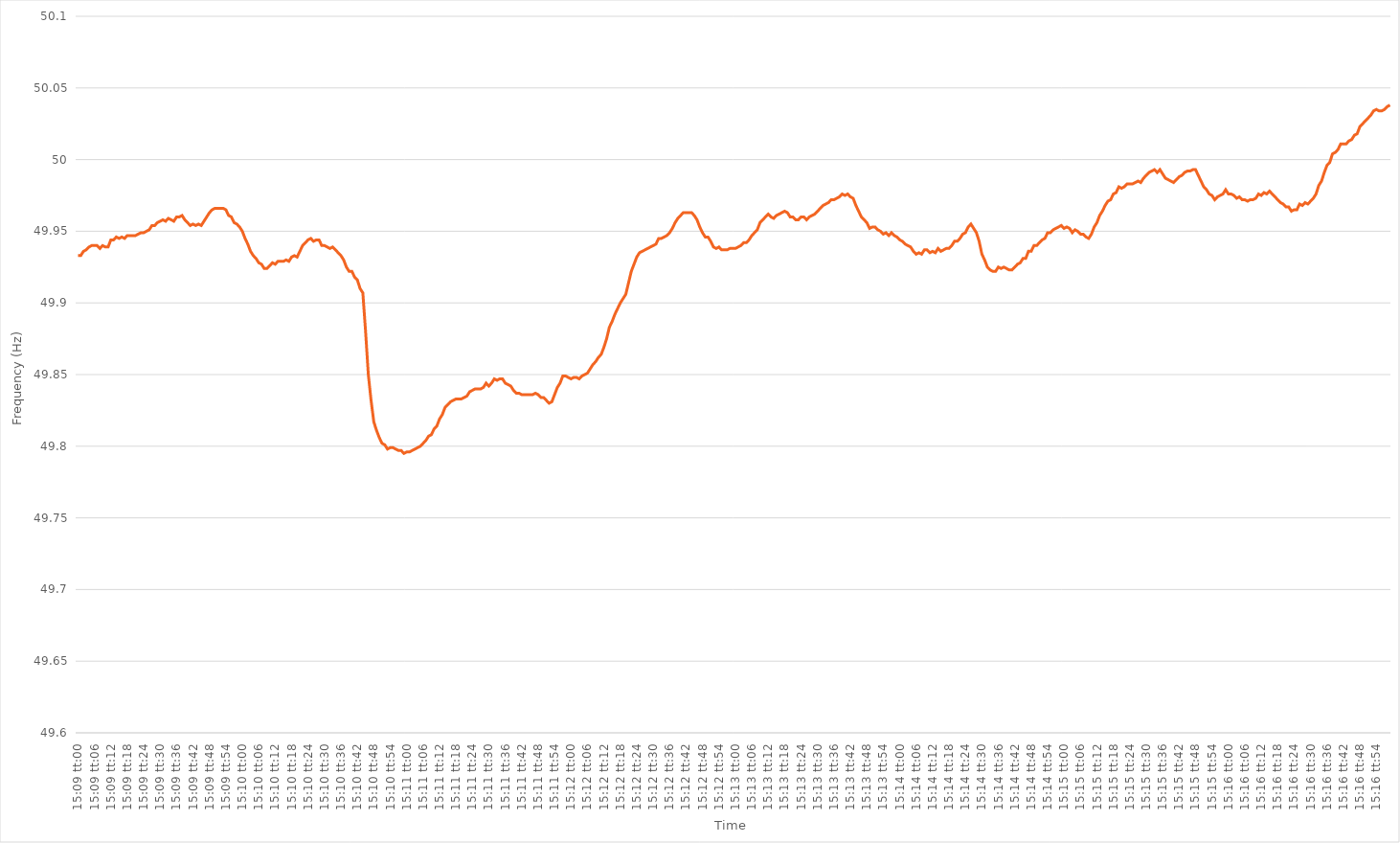
| Category | Series 0 |
|---|---|
| 0.63125 | 49.933 |
| 0.631261574074074 | 49.933 |
| 0.6312731481481482 | 49.936 |
| 0.6312847222222222 | 49.937 |
| 0.6312962962962964 | 49.939 |
| 0.6313078703703704 | 49.94 |
| 0.6313194444444444 | 49.94 |
| 0.6313310185185185 | 49.94 |
| 0.6313425925925926 | 49.938 |
| 0.6313541666666667 | 49.94 |
| 0.6313657407407408 | 49.939 |
| 0.6313773148148148 | 49.939 |
| 0.6313888888888889 | 49.944 |
| 0.6314004629629629 | 49.944 |
| 0.631412037037037 | 49.946 |
| 0.6314236111111111 | 49.945 |
| 0.6314351851851852 | 49.946 |
| 0.6314467592592593 | 49.945 |
| 0.6314583333333333 | 49.947 |
| 0.6314699074074074 | 49.947 |
| 0.6314814814814814 | 49.947 |
| 0.6314930555555556 | 49.947 |
| 0.6315046296296296 | 49.948 |
| 0.6315162037037038 | 49.949 |
| 0.6315277777777778 | 49.949 |
| 0.6315393518518518 | 49.95 |
| 0.6315509259259259 | 49.951 |
| 0.6315625 | 49.954 |
| 0.6315740740740741 | 49.954 |
| 0.6315856481481482 | 49.956 |
| 0.6315972222222223 | 49.957 |
| 0.6316087962962963 | 49.958 |
| 0.6316203703703703 | 49.957 |
| 0.6316319444444445 | 49.959 |
| 0.6316435185185185 | 49.958 |
| 0.6316550925925926 | 49.957 |
| 0.6316666666666667 | 49.96 |
| 0.6316782407407407 | 49.96 |
| 0.6316898148148148 | 49.961 |
| 0.6317013888888888 | 49.958 |
| 0.631712962962963 | 49.956 |
| 0.631724537037037 | 49.954 |
| 0.6317361111111112 | 49.955 |
| 0.6317476851851852 | 49.954 |
| 0.6317592592592592 | 49.955 |
| 0.6317708333333333 | 49.954 |
| 0.6317824074074074 | 49.957 |
| 0.6317939814814815 | 49.96 |
| 0.6318055555555556 | 49.963 |
| 0.6318171296296297 | 49.965 |
| 0.6318287037037037 | 49.966 |
| 0.6318402777777777 | 49.966 |
| 0.6318518518518519 | 49.966 |
| 0.6318634259259259 | 49.966 |
| 0.631875 | 49.965 |
| 0.6318865740740741 | 49.961 |
| 0.6318981481481482 | 49.96 |
| 0.6319097222222222 | 49.956 |
| 0.6319212962962962 | 49.955 |
| 0.6319328703703704 | 49.953 |
| 0.6319444444444444 | 49.95 |
| 0.6319560185185186 | 49.945 |
| 0.6319675925925926 | 49.941 |
| 0.6319791666666666 | 49.936 |
| 0.6319907407407407 | 49.933 |
| 0.6320023148148148 | 49.931 |
| 0.6320138888888889 | 49.928 |
| 0.632025462962963 | 49.927 |
| 0.6320370370370371 | 49.924 |
| 0.6320486111111111 | 49.924 |
| 0.6320601851851851 | 49.926 |
| 0.6320717592592593 | 49.928 |
| 0.6320833333333333 | 49.927 |
| 0.6320949074074075 | 49.929 |
| 0.6321064814814815 | 49.929 |
| 0.6321180555555556 | 49.929 |
| 0.6321296296296296 | 49.93 |
| 0.6321412037037036 | 49.929 |
| 0.6321527777777778 | 49.932 |
| 0.6321643518518518 | 49.933 |
| 0.632175925925926 | 49.932 |
| 0.6321875 | 49.936 |
| 0.632199074074074 | 49.94 |
| 0.6322106481481481 | 49.942 |
| 0.6322222222222222 | 49.944 |
| 0.6322337962962963 | 49.945 |
| 0.6322453703703704 | 49.943 |
| 0.6322569444444445 | 49.944 |
| 0.6322685185185185 | 49.944 |
| 0.6322800925925925 | 49.94 |
| 0.6322916666666667 | 49.94 |
| 0.6323032407407407 | 49.939 |
| 0.6323148148148149 | 49.938 |
| 0.6323263888888889 | 49.939 |
| 0.632337962962963 | 49.937 |
| 0.632349537037037 | 49.935 |
| 0.632361111111111 | 49.933 |
| 0.6323726851851852 | 49.93 |
| 0.6323842592592592 | 49.925 |
| 0.6323958333333334 | 49.922 |
| 0.6324074074074074 | 49.922 |
| 0.6324189814814815 | 49.918 |
| 0.6324305555555555 | 49.916 |
| 0.6324421296296296 | 49.91 |
| 0.6324537037037037 | 49.907 |
| 0.6324652777777778 | 49.88 |
| 0.6324768518518519 | 49.85 |
| 0.6324884259259259 | 49.832 |
| 0.6325 | 49.817 |
| 0.6325115740740741 | 49.811 |
| 0.6325231481481481 | 49.806 |
| 0.6325347222222223 | 49.802 |
| 0.6325462962962963 | 49.801 |
| 0.6325578703703704 | 49.798 |
| 0.6325694444444444 | 49.799 |
| 0.6325810185185184 | 49.799 |
| 0.6325925925925926 | 49.798 |
| 0.6326041666666666 | 49.797 |
| 0.6326157407407408 | 49.797 |
| 0.6326273148148148 | 49.795 |
| 0.6326388888888889 | 49.796 |
| 0.6326504629629629 | 49.796 |
| 0.632662037037037 | 49.797 |
| 0.6326736111111111 | 49.798 |
| 0.6326851851851852 | 49.799 |
| 0.6326967592592593 | 49.8 |
| 0.6327083333333333 | 49.802 |
| 0.6327199074074074 | 49.804 |
| 0.6327314814814815 | 49.807 |
| 0.6327430555555555 | 49.808 |
| 0.6327546296296297 | 49.812 |
| 0.6327662037037037 | 49.814 |
| 0.6327777777777778 | 49.819 |
| 0.6327893518518518 | 49.822 |
| 0.632800925925926 | 49.827 |
| 0.6328125 | 49.829 |
| 0.632824074074074 | 49.831 |
| 0.6328356481481482 | 49.832 |
| 0.6328472222222222 | 49.833 |
| 0.6328587962962963 | 49.833 |
| 0.6328703703703703 | 49.833 |
| 0.6328819444444445 | 49.834 |
| 0.6328935185185185 | 49.835 |
| 0.6329050925925926 | 49.838 |
| 0.6329166666666667 | 49.839 |
| 0.6329282407407407 | 49.84 |
| 0.6329398148148148 | 49.84 |
| 0.6329513888888889 | 49.84 |
| 0.632962962962963 | 49.841 |
| 0.6329745370370371 | 49.844 |
| 0.6329861111111111 | 49.842 |
| 0.6329976851851852 | 49.844 |
| 0.6330092592592592 | 49.847 |
| 0.6330208333333334 | 49.846 |
| 0.6330324074074074 | 49.847 |
| 0.6330439814814816 | 49.847 |
| 0.6330555555555556 | 49.844 |
| 0.6330671296296296 | 49.843 |
| 0.6330787037037037 | 49.842 |
| 0.6330902777777777 | 49.839 |
| 0.6331018518518519 | 49.837 |
| 0.6331134259259259 | 49.837 |
| 0.633125 | 49.836 |
| 0.6331365740740741 | 49.836 |
| 0.6331481481481481 | 49.836 |
| 0.6331597222222222 | 49.836 |
| 0.6331712962962963 | 49.836 |
| 0.6331828703703704 | 49.837 |
| 0.6331944444444445 | 49.836 |
| 0.6332060185185185 | 49.834 |
| 0.6332175925925926 | 49.834 |
| 0.6332291666666666 | 49.832 |
| 0.6332407407407408 | 49.83 |
| 0.6332523148148148 | 49.831 |
| 0.633263888888889 | 49.836 |
| 0.633275462962963 | 49.841 |
| 0.633287037037037 | 49.844 |
| 0.6332986111111111 | 49.849 |
| 0.6333101851851851 | 49.849 |
| 0.6333217592592593 | 49.848 |
| 0.6333333333333333 | 49.847 |
| 0.6333449074074075 | 49.848 |
| 0.6333564814814815 | 49.848 |
| 0.6333680555555555 | 49.847 |
| 0.6333796296296296 | 49.849 |
| 0.6333912037037037 | 49.85 |
| 0.6334027777777778 | 49.851 |
| 0.6334143518518519 | 49.854 |
| 0.633425925925926 | 49.857 |
| 0.6334375 | 49.859 |
| 0.633449074074074 | 49.862 |
| 0.6334606481481482 | 49.864 |
| 0.6334722222222222 | 49.869 |
| 0.6334837962962964 | 49.875 |
| 0.6334953703703704 | 49.883 |
| 0.6335069444444444 | 49.887 |
| 0.6335185185185185 | 49.892 |
| 0.6335300925925925 | 49.896 |
| 0.6335416666666667 | 49.9 |
| 0.6335532407407407 | 49.903 |
| 0.6335648148148149 | 49.906 |
| 0.6335763888888889 | 49.914 |
| 0.6335879629629629 | 49.922 |
| 0.633599537037037 | 49.927 |
| 0.6336111111111111 | 49.932 |
| 0.6336226851851852 | 49.935 |
| 0.6336342592592593 | 49.936 |
| 0.6336458333333334 | 49.937 |
| 0.6336574074074074 | 49.938 |
| 0.6336689814814814 | 49.939 |
| 0.6336805555555556 | 49.94 |
| 0.6336921296296296 | 49.941 |
| 0.6337037037037038 | 49.945 |
| 0.6337152777777778 | 49.945 |
| 0.6337268518518518 | 49.946 |
| 0.6337384259259259 | 49.947 |
| 0.63375 | 49.949 |
| 0.6337615740740741 | 49.952 |
| 0.6337731481481481 | 49.956 |
| 0.6337847222222223 | 49.959 |
| 0.6337962962962963 | 49.961 |
| 0.6338078703703703 | 49.963 |
| 0.6338194444444444 | 49.963 |
| 0.6338310185185185 | 49.963 |
| 0.6338425925925926 | 49.963 |
| 0.6338541666666667 | 49.961 |
| 0.6338657407407408 | 49.958 |
| 0.6338773148148148 | 49.953 |
| 0.6338888888888888 | 49.949 |
| 0.633900462962963 | 49.946 |
| 0.633912037037037 | 49.946 |
| 0.6339236111111112 | 49.943 |
| 0.6339351851851852 | 49.939 |
| 0.6339467592592593 | 49.938 |
| 0.6339583333333333 | 49.939 |
| 0.6339699074074074 | 49.937 |
| 0.6339814814814815 | 49.937 |
| 0.6339930555555555 | 49.937 |
| 0.6340046296296297 | 49.938 |
| 0.6340162037037037 | 49.938 |
| 0.6340277777777777 | 49.938 |
| 0.6340393518518518 | 49.939 |
| 0.6340509259259259 | 49.94 |
| 0.6340625 | 49.942 |
| 0.6340740740740741 | 49.942 |
| 0.6340856481481482 | 49.944 |
| 0.6340972222222222 | 49.947 |
| 0.6341087962962962 | 49.949 |
| 0.6341203703703704 | 49.951 |
| 0.6341319444444444 | 49.956 |
| 0.6341435185185186 | 49.958 |
| 0.6341550925925926 | 49.96 |
| 0.6341666666666667 | 49.962 |
| 0.6341782407407407 | 49.96 |
| 0.6341898148148148 | 49.959 |
| 0.6342013888888889 | 49.961 |
| 0.634212962962963 | 49.962 |
| 0.6342245370370371 | 49.963 |
| 0.6342361111111111 | 49.964 |
| 0.6342476851851852 | 49.963 |
| 0.6342592592592592 | 49.96 |
| 0.6342708333333333 | 49.96 |
| 0.6342824074074074 | 49.958 |
| 0.6342939814814815 | 49.958 |
| 0.6343055555555556 | 49.96 |
| 0.6343171296296296 | 49.96 |
| 0.6343287037037036 | 49.958 |
| 0.6343402777777778 | 49.96 |
| 0.6343518518518518 | 49.961 |
| 0.634363425925926 | 49.962 |
| 0.634375 | 49.964 |
| 0.6343865740740741 | 49.966 |
| 0.6343981481481481 | 49.968 |
| 0.6344097222222222 | 49.969 |
| 0.6344212962962963 | 49.97 |
| 0.6344328703703704 | 49.972 |
| 0.6344444444444445 | 49.972 |
| 0.6344560185185185 | 49.973 |
| 0.6344675925925926 | 49.974 |
| 0.6344791666666666 | 49.976 |
| 0.6344907407407407 | 49.975 |
| 0.6345023148148148 | 49.976 |
| 0.6345138888888889 | 49.974 |
| 0.634525462962963 | 49.973 |
| 0.634537037037037 | 49.968 |
| 0.634548611111111 | 49.964 |
| 0.6345601851851852 | 49.96 |
| 0.6345717592592592 | 49.958 |
| 0.6345833333333334 | 49.956 |
| 0.6345949074074074 | 49.952 |
| 0.6346064814814815 | 49.953 |
| 0.6346180555555555 | 49.953 |
| 0.6346296296296297 | 49.951 |
| 0.6346412037037037 | 49.95 |
| 0.6346527777777778 | 49.948 |
| 0.6346643518518519 | 49.949 |
| 0.6346759259259259 | 49.947 |
| 0.6346875 | 49.949 |
| 0.6346990740740741 | 49.947 |
| 0.6347106481481481 | 49.946 |
| 0.6347222222222222 | 49.944 |
| 0.6347337962962963 | 49.943 |
| 0.6347453703703704 | 49.941 |
| 0.6347569444444444 | 49.94 |
| 0.6347685185185185 | 49.939 |
| 0.6347800925925926 | 49.936 |
| 0.6347916666666666 | 49.934 |
| 0.6348032407407408 | 49.935 |
| 0.6348148148148148 | 49.934 |
| 0.6348263888888889 | 49.937 |
| 0.6348379629629629 | 49.937 |
| 0.6348495370370371 | 49.935 |
| 0.6348611111111111 | 49.936 |
| 0.6348726851851852 | 49.935 |
| 0.6348842592592593 | 49.938 |
| 0.6348958333333333 | 49.936 |
| 0.6349074074074074 | 49.937 |
| 0.6349189814814815 | 49.938 |
| 0.6349305555555556 | 49.938 |
| 0.6349421296296297 | 49.94 |
| 0.6349537037037037 | 49.943 |
| 0.6349652777777778 | 49.943 |
| 0.6349768518518518 | 49.945 |
| 0.6349884259259259 | 49.948 |
| 0.635 | 49.949 |
| 0.635011574074074 | 49.953 |
| 0.6350231481481482 | 49.955 |
| 0.6350347222222222 | 49.952 |
| 0.6350462962962963 | 49.949 |
| 0.6350578703703703 | 49.943 |
| 0.6350694444444445 | 49.934 |
| 0.6350810185185185 | 49.93 |
| 0.6350925925925927 | 49.925 |
| 0.6351041666666667 | 49.923 |
| 0.6351157407407407 | 49.922 |
| 0.6351273148148148 | 49.922 |
| 0.6351388888888889 | 49.925 |
| 0.635150462962963 | 49.924 |
| 0.6351620370370371 | 49.925 |
| 0.6351736111111111 | 49.924 |
| 0.6351851851851852 | 49.923 |
| 0.6351967592592592 | 49.923 |
| 0.6352083333333333 | 49.925 |
| 0.6352199074074074 | 49.927 |
| 0.6352314814814815 | 49.928 |
| 0.6352430555555556 | 49.931 |
| 0.6352546296296296 | 49.931 |
| 0.6352662037037037 | 49.936 |
| 0.6352777777777777 | 49.936 |
| 0.6352893518518519 | 49.94 |
| 0.6353009259259259 | 49.94 |
| 0.6353125000000001 | 49.942 |
| 0.6353240740740741 | 49.944 |
| 0.6353356481481481 | 49.945 |
| 0.6353472222222222 | 49.949 |
| 0.6353587962962963 | 49.949 |
| 0.6353703703703704 | 49.951 |
| 0.6353819444444445 | 49.952 |
| 0.6353935185185186 | 49.953 |
| 0.6354050925925926 | 49.954 |
| 0.6354166666666666 | 49.952 |
| 0.6354282407407407 | 49.953 |
| 0.6354398148148148 | 49.952 |
| 0.6354513888888889 | 49.949 |
| 0.635462962962963 | 49.951 |
| 0.635474537037037 | 49.95 |
| 0.6354861111111111 | 49.948 |
| 0.6354976851851851 | 49.948 |
| 0.6355092592592593 | 49.946 |
| 0.6355208333333333 | 49.945 |
| 0.6355324074074075 | 49.948 |
| 0.6355439814814815 | 49.953 |
| 0.6355555555555555 | 49.956 |
| 0.6355671296296296 | 49.961 |
| 0.6355787037037037 | 49.964 |
| 0.6355902777777778 | 49.968 |
| 0.6356018518518519 | 49.971 |
| 0.635613425925926 | 49.972 |
| 0.635625 | 49.976 |
| 0.635636574074074 | 49.977 |
| 0.6356481481481482 | 49.981 |
| 0.6356597222222222 | 49.98 |
| 0.6356712962962963 | 49.981 |
| 0.6356828703703704 | 49.983 |
| 0.6356944444444445 | 49.983 |
| 0.6357060185185185 | 49.983 |
| 0.6357175925925925 | 49.984 |
| 0.6357291666666667 | 49.985 |
| 0.6357407407407407 | 49.984 |
| 0.6357523148148149 | 49.987 |
| 0.6357638888888889 | 49.989 |
| 0.635775462962963 | 49.991 |
| 0.635787037037037 | 49.992 |
| 0.6357986111111111 | 49.993 |
| 0.6358101851851852 | 49.991 |
| 0.6358217592592593 | 49.993 |
| 0.6358333333333334 | 49.99 |
| 0.6358449074074074 | 49.987 |
| 0.6358564814814814 | 49.986 |
| 0.6358680555555556 | 49.985 |
| 0.6358796296296296 | 49.984 |
| 0.6358912037037037 | 49.986 |
| 0.6359027777777778 | 49.988 |
| 0.6359143518518519 | 49.989 |
| 0.6359259259259259 | 49.991 |
| 0.6359374999999999 | 49.992 |
| 0.6359490740740741 | 49.992 |
| 0.6359606481481481 | 49.993 |
| 0.6359722222222223 | 49.993 |
| 0.6359837962962963 | 49.989 |
| 0.6359953703703703 | 49.985 |
| 0.6360069444444444 | 49.981 |
| 0.6360185185185185 | 49.979 |
| 0.6360300925925926 | 49.976 |
| 0.6360416666666667 | 49.975 |
| 0.6360532407407408 | 49.972 |
| 0.6360648148148148 | 49.974 |
| 0.6360763888888888 | 49.975 |
| 0.636087962962963 | 49.976 |
| 0.636099537037037 | 49.979 |
| 0.6361111111111112 | 49.976 |
| 0.6361226851851852 | 49.976 |
| 0.6361342592592593 | 49.975 |
| 0.6361458333333333 | 49.973 |
| 0.6361574074074073 | 49.974 |
| 0.6361689814814815 | 49.972 |
| 0.6361805555555555 | 49.972 |
| 0.6361921296296297 | 49.971 |
| 0.6362037037037037 | 49.972 |
| 0.6362152777777778 | 49.972 |
| 0.6362268518518518 | 49.973 |
| 0.6362384259259259 | 49.976 |
| 0.63625 | 49.975 |
| 0.6362615740740741 | 49.977 |
| 0.6362731481481482 | 49.976 |
| 0.6362847222222222 | 49.978 |
| 0.6362962962962962 | 49.976 |
| 0.6363078703703704 | 49.974 |
| 0.6363194444444444 | 49.972 |
| 0.6363310185185186 | 49.97 |
| 0.6363425925925926 | 49.969 |
| 0.6363541666666667 | 49.967 |
| 0.6363657407407407 | 49.967 |
| 0.6363773148148147 | 49.964 |
| 0.6363888888888889 | 49.965 |
| 0.6364004629629629 | 49.965 |
| 0.6364120370370371 | 49.969 |
| 0.6364236111111111 | 49.968 |
| 0.6364351851851852 | 49.97 |
| 0.6364467592592592 | 49.969 |
| 0.6364583333333333 | 49.971 |
| 0.6364699074074074 | 49.973 |
| 0.6364814814814815 | 49.976 |
| 0.6364930555555556 | 49.982 |
| 0.6365046296296296 | 49.985 |
| 0.6365162037037037 | 49.991 |
| 0.6365277777777778 | 49.996 |
| 0.6365393518518518 | 49.998 |
| 0.636550925925926 | 50.004 |
| 0.6365625 | 50.005 |
| 0.6365740740740741 | 50.007 |
| 0.6365856481481481 | 50.011 |
| 0.6365972222222221 | 50.011 |
| 0.6366087962962963 | 50.011 |
| 0.6366203703703703 | 50.013 |
| 0.6366319444444445 | 50.014 |
| 0.6366435185185185 | 50.017 |
| 0.6366550925925926 | 50.018 |
| 0.6366666666666666 | 50.023 |
| 0.6366782407407408 | 50.025 |
| 0.6366898148148148 | 50.027 |
| 0.6367013888888889 | 50.029 |
| 0.636712962962963 | 50.031 |
| 0.636724537037037 | 50.034 |
| 0.6367361111111111 | 50.035 |
| 0.6367476851851852 | 50.034 |
| 0.6367592592592592 | 50.034 |
| 0.6367708333333334 | 50.035 |
| 0.6367824074074074 | 50.037 |
| 0.6367939814814815 | 50.038 |